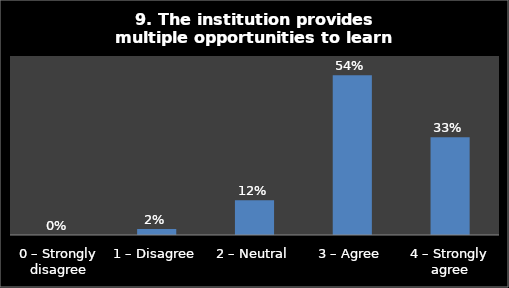
| Category | Series 0 |
|---|---|
| 0 – Strongly disagree | 0 |
| 1 – Disagree | 0.02 |
| 2 – Neutral | 0.117 |
| 3 – Agree | 0.535 |
| 4 – Strongly agree | 0.328 |